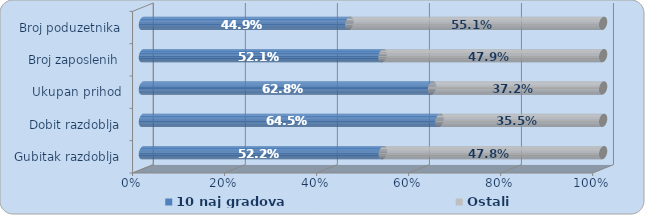
| Category | 10 naj gradova | Ostali |
|---|---|---|
| Gubitak razdoblja | 0.522 | 0.478 |
| Dobit razdoblja | 0.645 | 0.355 |
| Ukupan prihod | 0.628 | 0.372 |
| Broj zaposlenih | 0.521 | 0.479 |
| Broj poduzetnika | 0.449 | 0.551 |